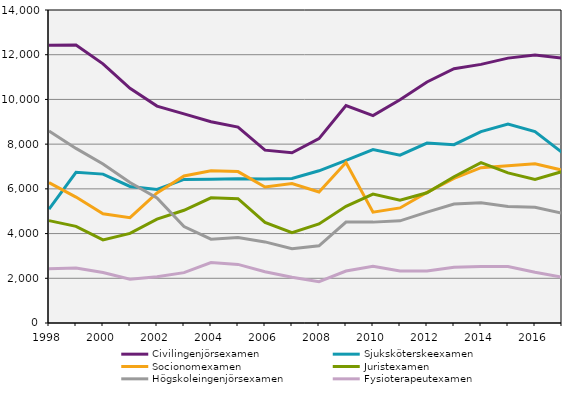
| Category | Civilingenjörsexamen | Sjuksköterskeexamen | Socionomexamen | Juristexamen | Högskoleingenjörsexamen | Fysioterapeutexamen |
|---|---|---|---|---|---|---|
| 1998.0 | 12422 | 5091 | 6280 | 4580 | 8590 | 2424 |
| 1999.0 | 12434 | 6738 | 5633 | 4323 | 7809 | 2457 |
| 2000.0 | 11591 | 6659 | 4884 | 3719 | 7111 | 2255 |
| 2001.0 | 10497 | 6109 | 4712 | 4008 | 6284 | 1961 |
| 2002.0 | 9702 | 5971 | 5814 | 4649 | 5594 | 2067 |
| 2003.0 | 9352 | 6421 | 6574 | 5041 | 4314 | 2253 |
| 2004.0 | 9003 | 6431 | 6807 | 5599 | 3751 | 2705 |
| 2005.0 | 8762 | 6456 | 6772 | 5560 | 3823 | 2622 |
| 2006.0 | 7732 | 6438 | 6085 | 4499 | 3627 | 2296 |
| 2007.0 | 7616 | 6466 | 6238 | 4042 | 3324 | 2046 |
| 2008.0 | 8249 | 6808 | 5862 | 4432 | 3452 | 1846 |
| 2009.0 | 9728 | 7276 | 7181 | 5218 | 4516 | 2323 |
| 2010.0 | 9275 | 7757 | 4960 | 5769 | 4512 | 2542 |
| 2011.0 | 9986 | 7504 | 5147 | 5497 | 4571 | 2324 |
| 2012.0 | 10782 | 8047 | 5844 | 5826 | 4960 | 2323 |
| 2013.0 | 11374 | 7976 | 6465 | 6543 | 5319 | 2498 |
| 2014.0 | 11567 | 8562 | 6945 | 7174 | 5375 | 2526 |
| 2015.0 | 11848 | 8902 | 7035 | 6715 | 5209 | 2528 |
| 2016.0 | 11992 | 8565 | 7119 | 6417 | 5172 | 2268 |
| 2017.0 | 11843 | 7629 | 6837 | 6774 | 4914 | 2051 |